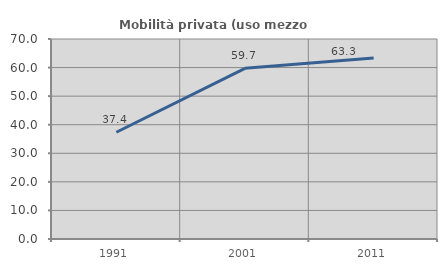
| Category | Mobilità privata (uso mezzo privato) |
|---|---|
| 1991.0 | 37.36 |
| 2001.0 | 59.749 |
| 2011.0 | 63.316 |